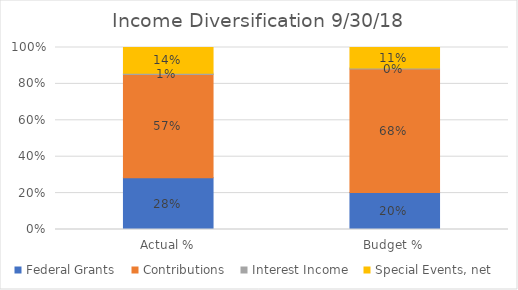
| Category | Federal Grants | Contributions | Interest Income | Special Events, net |
|---|---|---|---|---|
| Actual % | 0.284 | 0.568 | 0.006 | 0.142 |
| Budget % | 0.204 | 0.679 | 0.005 | 0.113 |